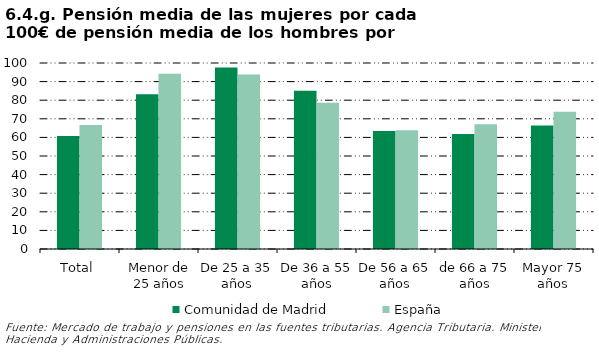
| Category | Comunidad de Madrid | España |
|---|---|---|
| Total | 60.798 | 66.658 |
| Menor de 25 años | 83.157 | 94.256 |
| De 25 a 35 años | 97.643 | 93.756 |
| De 36 a 55 años | 85.109 | 78.688 |
| De 56 a 65 años | 63.382 | 63.854 |
| de 66 a 75 años | 61.839 | 67.104 |
| Mayor 75 años | 66.443 | 73.74 |